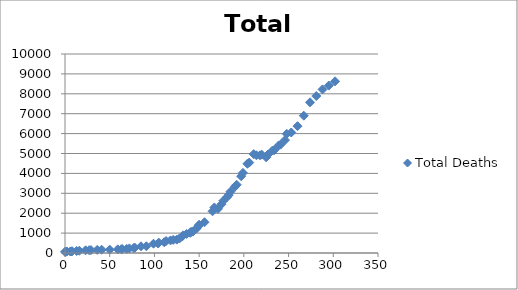
| Category | Total Deaths |
|---|---|
| 0.0 | 59 |
| 1.0 | 60 |
| 2.0 | 77 |
| 6.0 | 76 |
| 7.0 | 82 |
| 8.0 | 88 |
| 13.0 | 102 |
| 16.0 | 115 |
| 23.0 | 135 |
| 27.0 | 142 |
| 29.0 | 147 |
| 36.0 | 157 |
| 41.0 | 166 |
| 50.0 | 168 |
| 59.0 | 183 |
| 63.0 | 187 |
| 64.0 | 200 |
| 69.0 | 208 |
| 72.0 | 231 |
| 77.0 | 253 |
| 78.0 | 270 |
| 85.0 | 337 |
| 91.0 | 338 |
| 99.0 | 467 |
| 104.0 | 481 |
| 105.0 | 518 |
| 111.0 | 539 |
| 113.0 | 601 |
| 118.0 | 632 |
| 121.0 | 660 |
| 125.0 | 672 |
| 128.0 | 728 |
| 131.0 | 825 |
| 132.0 | 886 |
| 136.0 | 959 |
| 140.0 | 1011 |
| 141.0 | 1066 |
| 143.0 | 1076 |
| 147.0 | 1225 |
| 149.0 | 1346 |
| 150.0 | 1422 |
| 156.0 | 1546 |
| 165.0 | 2097 |
| 167.0 | 2288 |
| 171.0 | 2218 |
| 175.0 | 2453 |
| 177.0 | 2622 |
| 181.0 | 2803 |
| 183.0 | 2909 |
| 185.0 | 3083 |
| 190.0 | 3330 |
| 192.0 | 3431 |
| 197.0 | 3857 |
| 199.0 | 4024 |
| 204.0 | 4484 |
| 206.0 | 4546 |
| 211.0 | 4968 |
| 214.0 | 4912 |
| 218.0 | 4910 |
| 220.0 | 4941 |
| 225.0 | 4808 |
| 227.0 | 4950 |
| 232.0 | 5147 |
| 234.0 | 5165 |
| 239.0 | 5406 |
| 241.0 | 5444 |
| 246.0 | 5674 |
| 248.0 | 5987 |
| 253.0 | 6055 |
| 260.0 | 6373 |
| 267.0 | 6900 |
| 274.0 | 7573 |
| 281.0 | 7889 |
| 288.0 | 8220 |
| 295.0 | 8414 |
| 302.0 | 8626 |